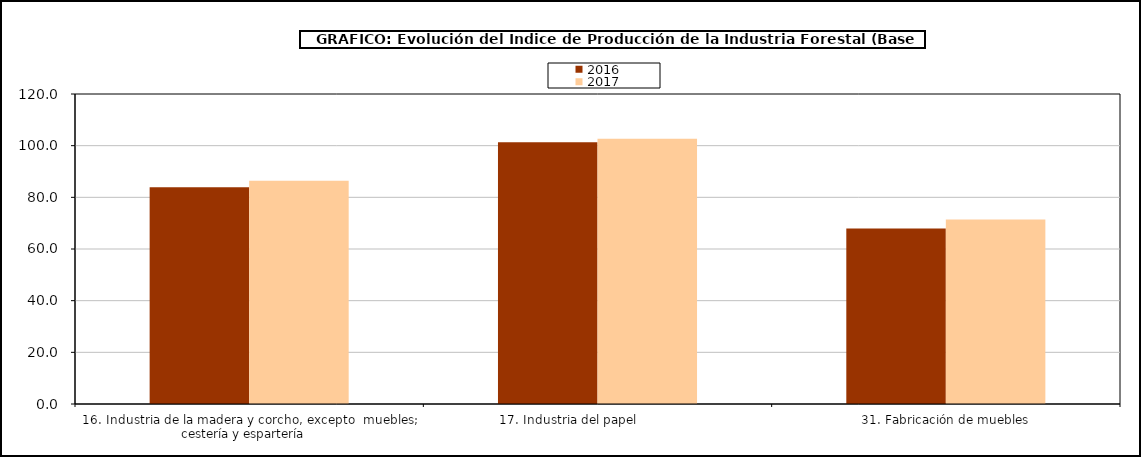
| Category | 2016 | 2017 |
|---|---|---|
| 16. Industria de la madera y corcho, excepto  muebles; cestería y espartería    | 83.888 | 86.465 |
| 17. Industria del papel                | 101.324 | 102.66 |
| 31. Fabricación de muebles | 67.98 | 71.45 |